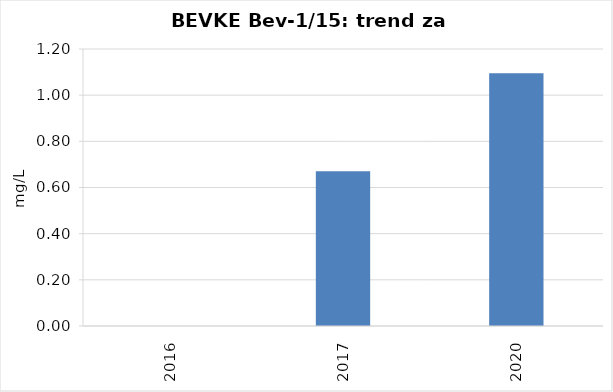
| Category | Vsota |
|---|---|
| 2016 | 0 |
| 2017 | 0.67 |
| 2020 | 1.095 |